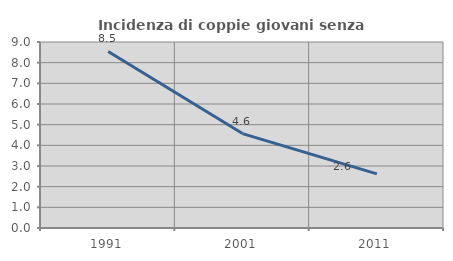
| Category | Incidenza di coppie giovani senza figli |
|---|---|
| 1991.0 | 8.543 |
| 2001.0 | 4.569 |
| 2011.0 | 2.618 |